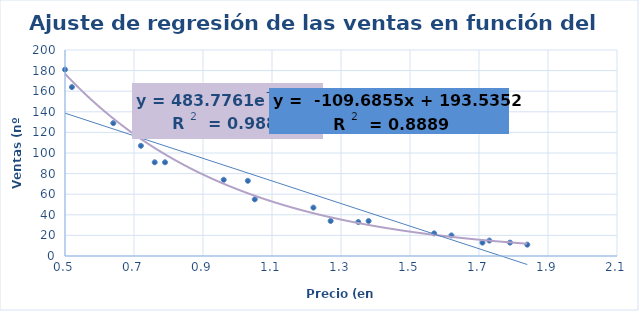
| Category | Ventas (número de botellas) |
|---|---|
| 0.5 | 181 |
| 1.35 | 33 |
| 0.79 | 91 |
| 1.71 | 13 |
| 1.38 | 34 |
| 1.22 | 47 |
| 1.03 | 73 |
| 1.84 | 11 |
| 1.73 | 15 |
| 1.62 | 20 |
| 0.76 | 91 |
| 1.79 | 13 |
| 1.57 | 22 |
| 1.27 | 34 |
| 0.96 | 74 |
| 0.52 | 164 |
| 0.64 | 129 |
| 1.05 | 55 |
| 0.72 | 107 |
| 0.75 | 119 |